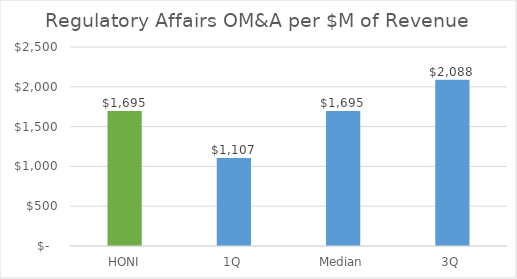
| Category | Regulatory Affairs OM&A per $M of Revenue  |
|---|---|
| HONI | 1694.944 |
| 1Q | 1106.778 |
| Median | 1694.944 |
| 3Q | 2088.326 |